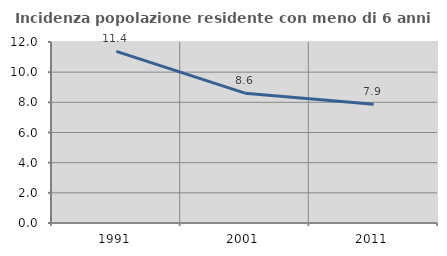
| Category | Incidenza popolazione residente con meno di 6 anni |
|---|---|
| 1991.0 | 11.376 |
| 2001.0 | 8.606 |
| 2011.0 | 7.874 |